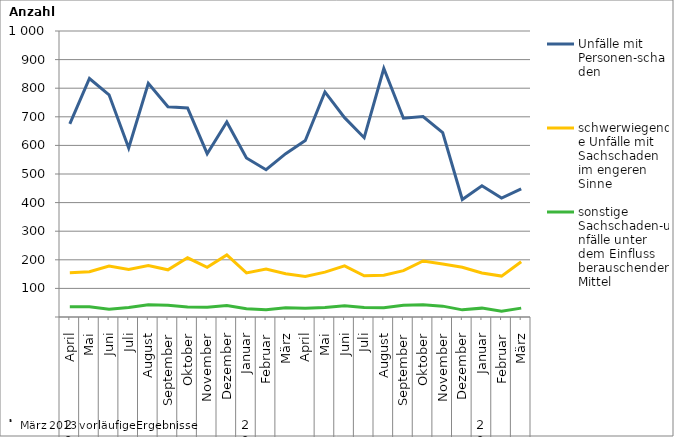
| Category | Unfälle mit Personen-schaden | schwerwiegende Unfälle mit Sachschaden   im engeren Sinne | sonstige Sachschaden-unfälle unter dem Einfluss berauschender Mittel |
|---|---|---|---|
| 0 | 675 | 155 | 36 |
| 1 | 834 | 158 | 36 |
| 2 | 777 | 178 | 27 |
| 3 | 591 | 166 | 33 |
| 4 | 817 | 180 | 43 |
| 5 | 735 | 165 | 41 |
| 6 | 731 | 207 | 35 |
| 7 | 571 | 174 | 34 |
| 8 | 682 | 217 | 40 |
| 9 | 556 | 154 | 29 |
| 10 | 515 | 168 | 25 |
| 11 | 571 | 151 | 32 |
| 12 | 617 | 142 | 31 |
| 13 | 787 | 157 | 33 |
| 14 | 697 | 179 | 39 |
| 15 | 627 | 144 | 33 |
| 16 | 869 | 146 | 32 |
| 17 | 695 | 162 | 41 |
| 18 | 701 | 196 | 43 |
| 19 | 645 | 185 | 38 |
| 20 | 411 | 174 | 25 |
| 21 | 459 | 154 | 31 |
| 22 | 416 | 143 | 20 |
| 23 | 448 | 193 | 31 |